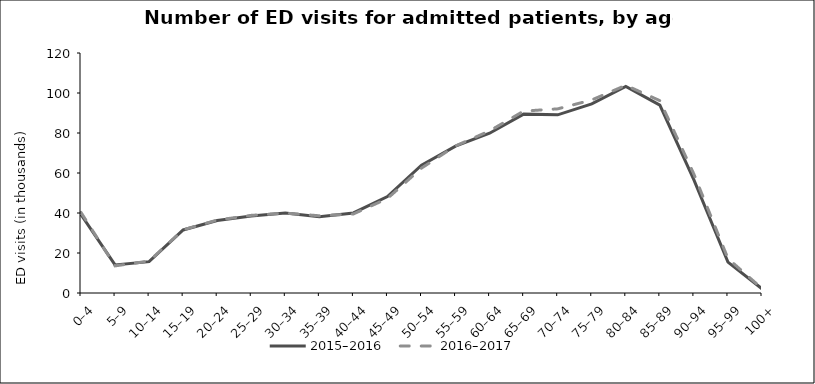
| Category | 2015–2016 | 2016–2017 |
|---|---|---|
| 0–4 | 39.226 | 40.298 |
| 5–9 | 14.049 | 13.555 |
| 10–14 | 15.669 | 15.969 |
| 15–19 | 31.524 | 31.591 |
| 20–24 | 36.203 | 36.461 |
| 25–29 | 38.522 | 38.82 |
| 30–34 | 40.037 | 39.938 |
| 35–39 | 38.134 | 38.616 |
| 40–44 | 40.03 | 39.517 |
| 45–49 | 48.211 | 47.244 |
| 50–54 | 63.933 | 62.441 |
| 55–59 | 73.391 | 73.536 |
| 60–64 | 79.873 | 81.063 |
| 65–69 | 89.436 | 90.944 |
| 70–74 | 89.093 | 92.068 |
| 75–79 | 94.563 | 96.52 |
| 80–84 | 103.298 | 103.861 |
| 85–89 | 93.933 | 96.171 |
| 90–94 | 56.586 | 59.426 |
| 95–99 | 15.416 | 17.234 |
| 100+ | 2.104 | 2.244 |